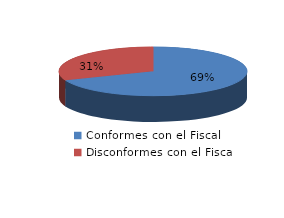
| Category | Series 0 |
|---|---|
| 0 | 49 |
| 1 | 22 |